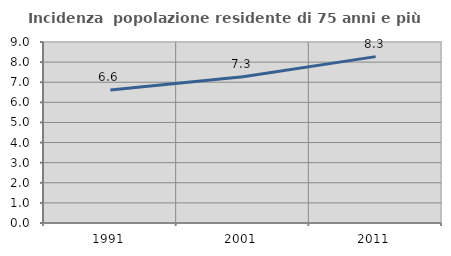
| Category | Incidenza  popolazione residente di 75 anni e più |
|---|---|
| 1991.0 | 6.608 |
| 2001.0 | 7.267 |
| 2011.0 | 8.274 |